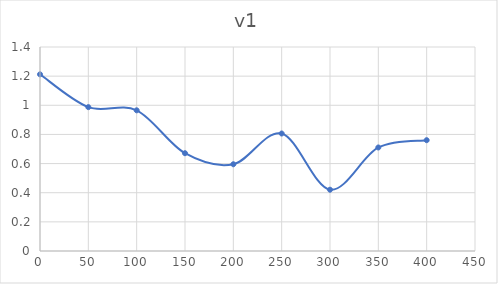
| Category | Series 0 |
|---|---|
| 0.0 | 1.212 |
| 50.0 | 0.987 |
| 100.0 | 0.966 |
| 150.0 | 0.671 |
| 200.0 | 0.595 |
| 250.0 | 0.806 |
| 300.0 | 0.421 |
| 350.0 | 0.71 |
| 400.0 | 0.76 |